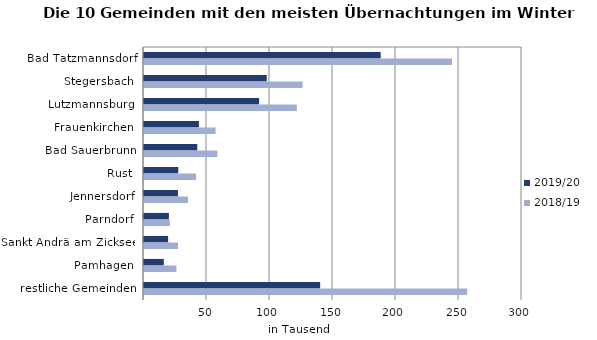
| Category | 2019/20 | 2018/19 |
|---|---|---|
| Bad Tatzmannsdorf | 187856 | 244437 |
| Stegersbach | 97431 | 125870 |
| Lutzmannsburg | 91359 | 121298 |
| Frauenkirchen | 43605 | 56827 |
| Bad Sauerbrunn | 42285 | 58200 |
| Rust | 27210 | 41396 |
| Jennersdorf | 26942 | 34912 |
| Parndorf | 19771 | 20457 |
| Sankt Andrä am Zicksee | 19129 | 26958 |
| Pamhagen | 15715 | 25733 |
| restliche Gemeinden | 139809 | 256512 |